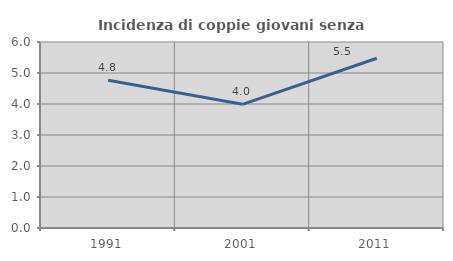
| Category | Incidenza di coppie giovani senza figli |
|---|---|
| 1991.0 | 4.769 |
| 2001.0 | 3.989 |
| 2011.0 | 5.476 |